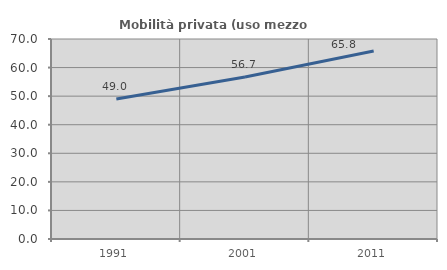
| Category | Mobilità privata (uso mezzo privato) |
|---|---|
| 1991.0 | 48.993 |
| 2001.0 | 56.703 |
| 2011.0 | 65.793 |